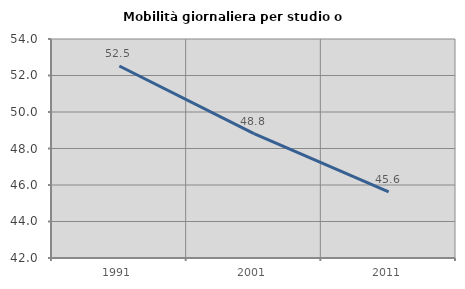
| Category | Mobilità giornaliera per studio o lavoro |
|---|---|
| 1991.0 | 52.52 |
| 2001.0 | 48.82 |
| 2011.0 | 45.626 |